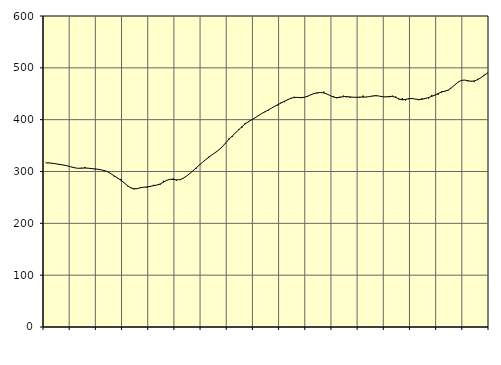
| Category | Piggar | Series 1 |
|---|---|---|
| nan | 316.8 | 316.72 |
| 87.0 | 316.8 | 316.53 |
| 87.0 | 316.2 | 315.98 |
| 87.0 | 314.6 | 314.95 |
| nan | 312.8 | 313.84 |
| 88.0 | 313.3 | 312.93 |
| 88.0 | 311.3 | 311.8 |
| 88.0 | 309.8 | 310.27 |
| nan | 308.3 | 308.58 |
| 89.0 | 307 | 306.98 |
| 89.0 | 306.1 | 306.17 |
| 89.0 | 307.3 | 306.36 |
| nan | 308.8 | 306.72 |
| 90.0 | 306.2 | 306.39 |
| 90.0 | 306.2 | 305.62 |
| 90.0 | 304.2 | 305.03 |
| nan | 303.8 | 304.3 |
| 91.0 | 303.2 | 303.17 |
| 91.0 | 300.7 | 301.68 |
| 91.0 | 299 | 299.39 |
| nan | 295.6 | 295.65 |
| 92.0 | 289.9 | 291.29 |
| 92.0 | 286.9 | 287.36 |
| 92.0 | 285.6 | 283.18 |
| nan | 277.7 | 278.16 |
| 93.0 | 271.5 | 272.77 |
| 93.0 | 270 | 268.54 |
| 93.0 | 265.5 | 266.58 |
| nan | 268.1 | 267.08 |
| 94.0 | 269.5 | 268.77 |
| 94.0 | 269.6 | 269.73 |
| 94.0 | 268.9 | 270.16 |
| nan | 270 | 271.27 |
| 95.0 | 274.3 | 272.68 |
| 95.0 | 273.8 | 273.87 |
| 95.0 | 274.6 | 275.93 |
| nan | 282 | 279.39 |
| 96.0 | 282.6 | 283.01 |
| 96.0 | 284.8 | 284.93 |
| 96.0 | 286.6 | 284.69 |
| nan | 282.5 | 283.81 |
| 97.0 | 283.7 | 284.23 |
| 97.0 | 286.5 | 286.82 |
| 97.0 | 291.2 | 290.93 |
| nan | 295.5 | 295.74 |
| 98.0 | 301.3 | 301.21 |
| 98.0 | 305.2 | 307.01 |
| 98.0 | 313 | 312.55 |
| nan | 318.2 | 318.17 |
| 99.0 | 323.2 | 323.27 |
| 99.0 | 329.6 | 328.18 |
| 99.0 | 332.1 | 332.84 |
| nan | 337.7 | 337.21 |
| 0.0 | 341.6 | 341.88 |
| 0.0 | 347.3 | 347.82 |
| 0.0 | 354.3 | 354.96 |
| nan | 363.7 | 361.92 |
| 1.0 | 366.6 | 368.26 |
| 1.0 | 374.7 | 374.25 |
| 1.0 | 381.8 | 380.38 |
| nan | 384.4 | 386.51 |
| 2.0 | 393.8 | 391.87 |
| 2.0 | 395.3 | 396.23 |
| 2.0 | 400.2 | 399.83 |
| nan | 403.6 | 403.53 |
| 3.0 | 408.6 | 407.81 |
| 3.0 | 412 | 411.72 |
| 3.0 | 414.5 | 415.12 |
| nan | 417.4 | 418.61 |
| 4.0 | 422.1 | 422.15 |
| 4.0 | 426.1 | 425.73 |
| 4.0 | 427.5 | 429 |
| nan | 433.8 | 432.35 |
| 5.0 | 433.7 | 435.51 |
| 5.0 | 439.1 | 438.56 |
| 5.0 | 441.9 | 441.36 |
| nan | 444.2 | 442.88 |
| 6.0 | 442.5 | 442.99 |
| 6.0 | 441.5 | 442.63 |
| 6.0 | 443.4 | 443.09 |
| nan | 443.7 | 445.03 |
| 7.0 | 448.2 | 447.77 |
| 7.0 | 450.9 | 450.28 |
| 7.0 | 450.7 | 451.83 |
| nan | 452.6 | 452.34 |
| 8.0 | 454.3 | 451.61 |
| 8.0 | 449.3 | 449.44 |
| 8.0 | 446.1 | 446.32 |
| nan | 445 | 443.59 |
| 9.0 | 441.3 | 442.43 |
| 9.0 | 444.3 | 443.25 |
| 9.0 | 446.4 | 444.39 |
| nan | 443.2 | 444.52 |
| 10.0 | 442.3 | 443.89 |
| 10.0 | 443.4 | 443.25 |
| 10.0 | 442.5 | 443.17 |
| nan | 442.1 | 443.52 |
| 11.0 | 446.4 | 443.63 |
| 11.0 | 443.4 | 443.76 |
| 11.0 | 444.4 | 444.53 |
| nan | 445.1 | 445.8 |
| 12.0 | 445.3 | 446.33 |
| 12.0 | 445.3 | 445.43 |
| 12.0 | 444 | 444.23 |
| nan | 443.4 | 443.92 |
| 13.0 | 443.2 | 444.71 |
| 13.0 | 446.3 | 444.89 |
| 13.0 | 444.6 | 442.98 |
| nan | 439.1 | 439.94 |
| 14.0 | 441.6 | 438.26 |
| 14.0 | 437 | 439 |
| 14.0 | 439.3 | 440.53 |
| nan | 441.8 | 440.83 |
| 15.0 | 439.4 | 439.71 |
| 15.0 | 437.5 | 438.92 |
| 15.0 | 441.4 | 439.38 |
| nan | 442 | 440.69 |
| 16.0 | 440.4 | 442.65 |
| 16.0 | 447.4 | 444.86 |
| 16.0 | 447 | 447.53 |
| nan | 447.9 | 450.59 |
| 17.0 | 455.3 | 453.17 |
| 17.0 | 454.3 | 454.99 |
| 17.0 | 456.2 | 457.03 |
| nan | 461.8 | 461.12 |
| 18.0 | 466.5 | 466.87 |
| 18.0 | 472.5 | 472.2 |
| 18.0 | 475.7 | 475.63 |
| nan | 476.5 | 476.39 |
| 19.0 | 473.9 | 475.2 |
| 19.0 | 473.6 | 474.1 |
| 19.0 | 472.4 | 474.73 |
| nan | 478.8 | 477.05 |
| 20.0 | 480.7 | 480.85 |
| 20.0 | 486.4 | 485.45 |
| 20.0 | 490.6 | 489.72 |